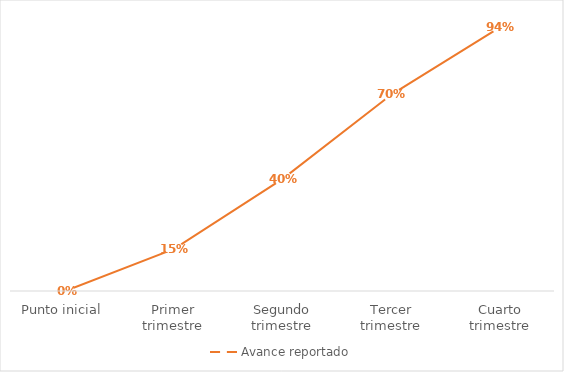
| Category | Avance reportado |
|---|---|
| Punto inicial | 0 |
| Primer trimestre | 0.15 |
| Segundo trimestre | 0.4 |
| Tercer trimestre | 0.7 |
| Cuarto trimestre | 0.94 |